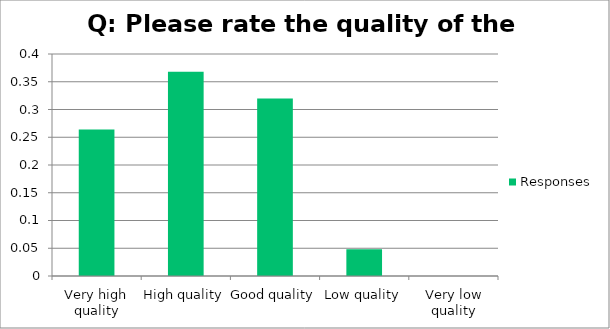
| Category | Responses |
|---|---|
| Very high quality | 0.264 |
| High quality | 0.368 |
| Good quality | 0.32 |
| Low quality | 0.048 |
| Very low quality | 0 |